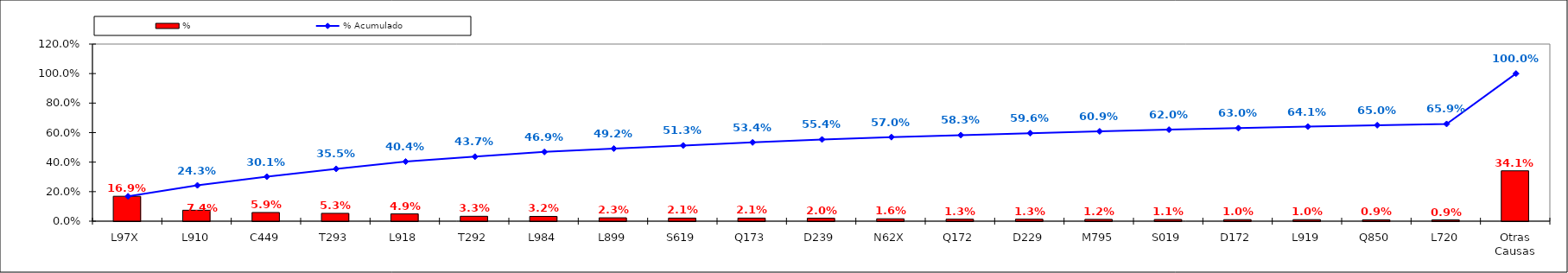
| Category | % |
|---|---|
| L97X | 0.169 |
| L910 | 0.074 |
| C449 | 0.059 |
| T293 | 0.053 |
| L918 | 0.049 |
| T292 | 0.033 |
| L984 | 0.032 |
| L899 | 0.023 |
| S619 | 0.021 |
| Q173 | 0.021 |
| D239 | 0.02 |
| N62X | 0.016 |
| Q172 | 0.013 |
| D229 | 0.013 |
| M795 | 0.012 |
| S019 | 0.011 |
| D172 | 0.01 |
| L919 | 0.01 |
| Q850 | 0.009 |
| L720 | 0.009 |
| Otras Causas | 0.341 |